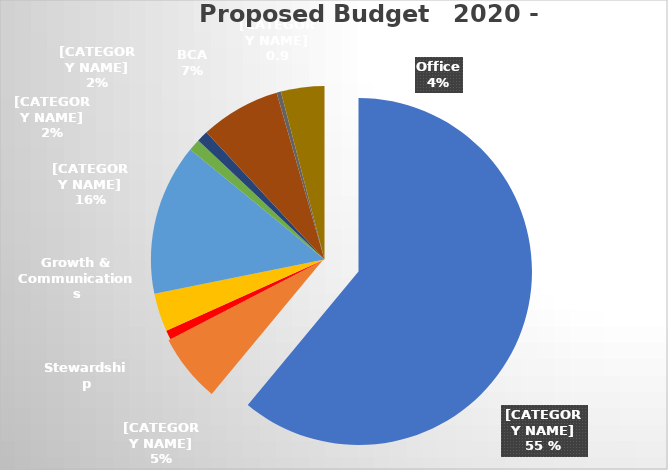
| Category |     Budget     2019 - 2020  | % of Budget |  Proposed Budget                  2020 - 2021  |
|---|---|---|---|
| Salaries & Benefits * | 302265 | 0.554 | 267767 |
| Other Lay Ministry | 31555 | 0.052 | 25380 |
| Stewardship | 4350 | 0.014 | 6972 |
| Growth & Communications | 17700 | 0.038 | 18600 |
| Properties | 69750 | 0.157 | 75975 |
| Youth | 5500 | 0.02 | 9750 |
| Education | 5250 | 0.019 | 9250 |
| BCA | 36956 | 0.084 | 40751 |
| Fellowship | 2000 | 0.009 | 4500 |
| Office | 20050 | 0.043 | 20700 |
| Outreach | 0 | 0.008 | 4000 |